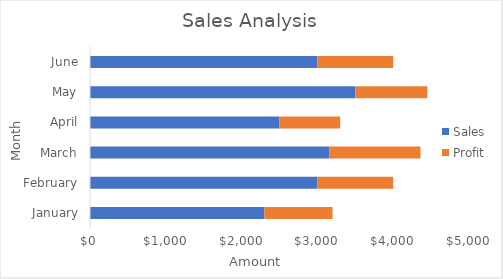
| Category | Sales | Profit |
|---|---|---|
| January | 2300 | 900 |
| February | 3000 | 1000 |
| March | 3160 | 1200 |
| April | 2500 | 800 |
| May | 3500 | 950 |
| June | 3000 | 1000 |